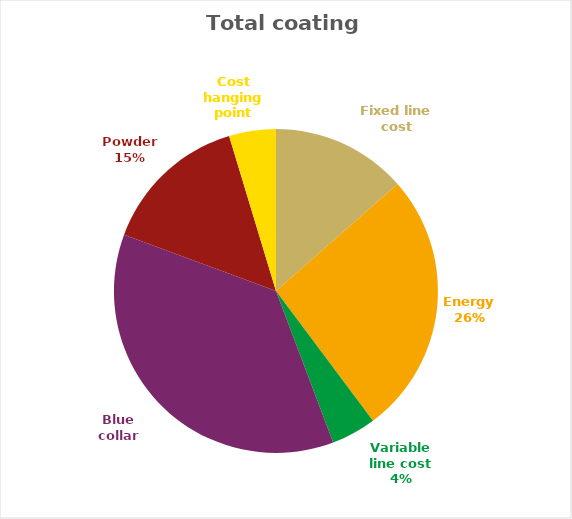
| Category | Series 0 | Series 1 |
|---|---|---|
| Fixed line cost | 0.02 | 0.135 |
| Energy | 0.039 | 0.262 |
| Variable line cost | 0.007 | 0.045 |
| Blue collar | 0.054 | 0.363 |
| Powder  | 0.022 | 0.147 |
| Cost hanging point | 0.007 | 0.047 |